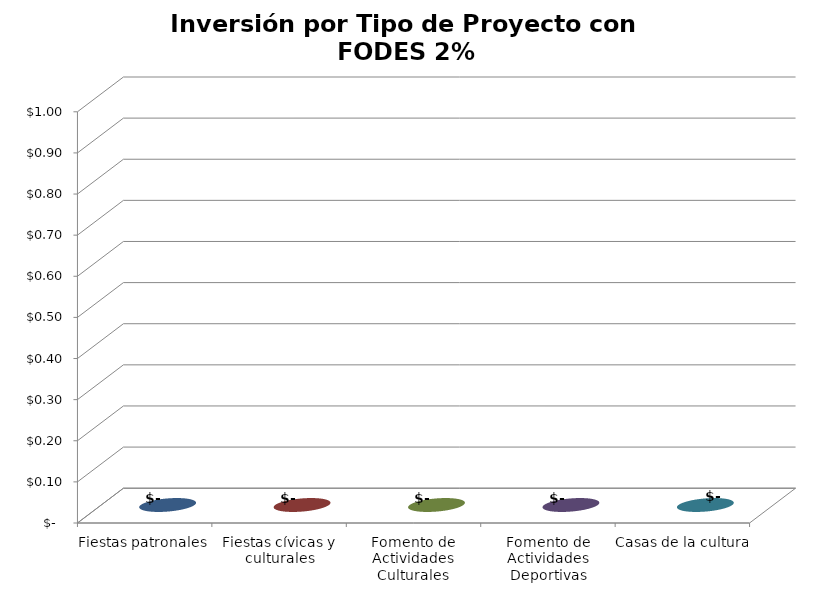
| Category | Series 0 |
|---|---|
| Fiestas patronales | 0 |
| Fiestas cívicas y culturales | 0 |
| Fomento de Actividades Culturales | 0 |
| Fomento de Actividades Deportivas | 0 |
| Casas de la cultura | 0 |